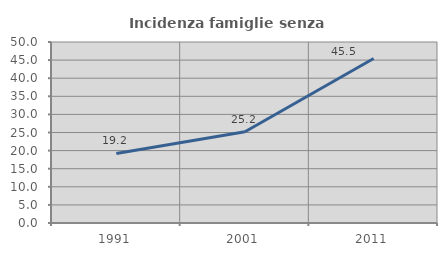
| Category | Incidenza famiglie senza nuclei |
|---|---|
| 1991.0 | 19.221 |
| 2001.0 | 25.207 |
| 2011.0 | 45.455 |